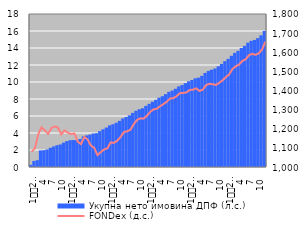
| Category | Укупнa нето имовина ДПФ (л.с.) |
|---|---|
| 1
2007. | 0.249 |
| 2 | 0.705 |
| 3 | 0.801 |
| 4 | 1.949 |
| 5 | 1.984 |
| 6 | 2.07 |
| 7 | 2.261 |
| 8 | 2.422 |
| 9 | 2.563 |
| 10 | 2.653 |
| 11 | 2.867 |
| 12 | 3.046 |
| 1
2008. | 3.155 |
| 2 | 3.167 |
| 3 | 3.177 |
| 4 | 3.297 |
| 5 | 3.602 |
| 6 | 3.719 |
| 7 | 3.811 |
| 8 | 3.934 |
| 9 | 3.976 |
| 10 | 4.22 |
| 11 | 4.435 |
| 12 | 4.641 |
| 1
2009. | 4.903 |
| 2 | 5.027 |
| 3 | 5.204 |
| 4 | 5.43 |
| 5 | 5.714 |
| 6 | 5.882 |
| 7 | 6.078 |
| 8 | 6.364 |
| 9 | 6.611 |
| 10 | 6.792 |
| 11 | 6.912 |
| 12 | 7.188 |
| 1
2010. | 7.432 |
| 2 | 7.676 |
| 3 | 7.899 |
| 4 | 8.15 |
| 5 | 8.327 |
| 6 | 8.568 |
| 7 | 8.841 |
| 8 | 8.995 |
| 9 | 9.206 |
| 10 | 9.488 |
| 11 | 9.639 |
| 12 | 9.863 |
| 1
2011. | 10.082 |
| 2 | 10.238 |
| 3 | 10.435 |
| 4 | 10.51 |
| 5 | 10.725 |
| 6 | 11.067 |
| 7 | 11.306 |
| 8 | 11.45 |
| 9 | 11.587 |
| 10 | 11.853 |
| 11 | 12.123 |
| 12 | 12.452 |
| 1
2012. | 12.722 |
| 2 | 13.086 |
| 3 | 13.424 |
| 4 | 13.664 |
| 5 | 13.998 |
| 6 | 14.251 |
| 7 | 14.626 |
| 8 | 14.843 |
| 9 | 14.949 |
| 10 | 15.164 |
| 11 | 15.488 |
| 12 | 16.011 |